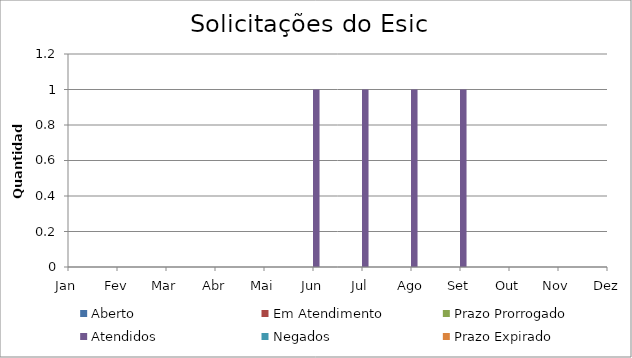
| Category | Aberto | Em Atendimento | Prazo Prorrogado | Atendidos | Negados | Prazo Expirado |
|---|---|---|---|---|---|---|
| Jan | 0 | 0 | 0 | 0 | 0 | 0 |
| Fev | 0 | 0 | 0 | 0 | 0 | 0 |
| Mar | 0 | 0 | 0 | 0 | 0 | 0 |
| Abr | 0 | 0 | 0 | 0 | 0 | 0 |
| Mai | 0 | 0 | 0 | 0 | 0 | 0 |
| Jun | 0 | 0 | 0 | 1 | 0 | 0 |
| Jul | 0 | 0 | 0 | 1 | 0 | 0 |
| Ago | 0 | 0 | 0 | 1 | 0 | 0 |
| Set | 0 | 0 | 0 | 1 | 0 | 0 |
| Out | 0 | 0 | 0 | 0 | 0 | 0 |
| Nov | 0 | 0 | 0 | 0 | 0 | 0 |
| Dez | 0 | 0 | 0 | 0 | 0 | 0 |